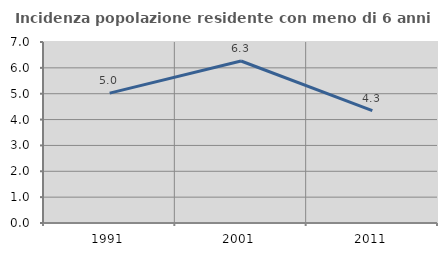
| Category | Incidenza popolazione residente con meno di 6 anni |
|---|---|
| 1991.0 | 5.022 |
| 2001.0 | 6.265 |
| 2011.0 | 4.348 |